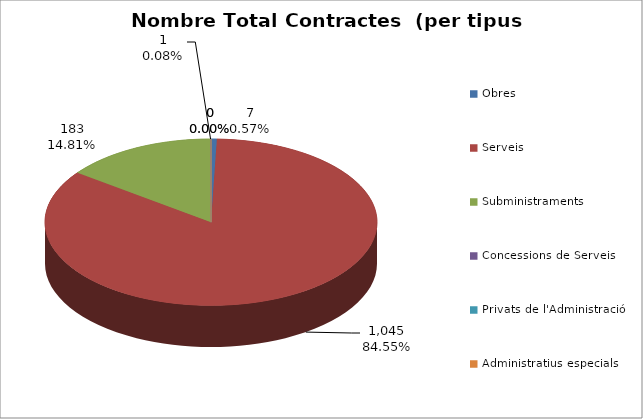
| Category | Nombre Total Contractes |
|---|---|
| Obres | 7 |
| Serveis | 1045 |
| Subministraments | 183 |
| Concessions de Serveis | 1 |
| Privats de l'Administració | 0 |
| Administratius especials | 0 |